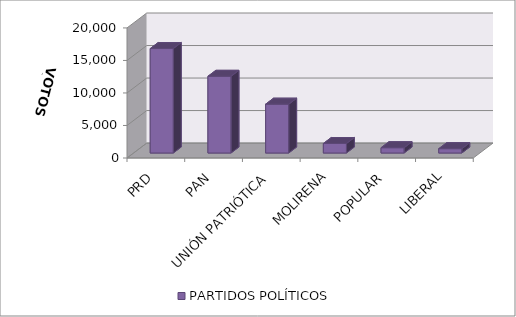
| Category | PARTIDOS POLÍTICOS |
|---|---|
| PRD | 16061 |
| PAN | 11795 |
| UNIÓN PATRIÓTICA | 7510 |
| MOLIRENA | 1457 |
| POPULAR | 812 |
| LIBERAL | 665 |